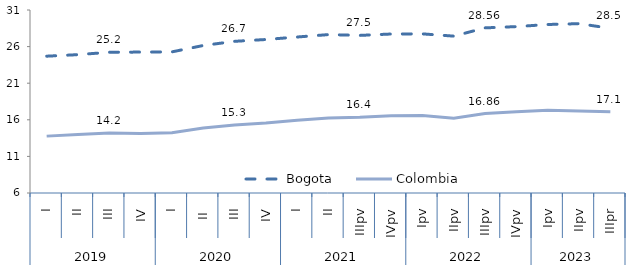
| Category | Bogota | Colombia |
|---|---|---|
| 0 | 24.69 | 13.77 |
| 1 | 24.9 | 13.99 |
| 2 | 25.23 | 14.2 |
| 3 | 25.25 | 14.14 |
| 4 | 25.28 | 14.23 |
| 5 | 26.15 | 14.88 |
| 6 | 26.72 | 15.29 |
| 7 | 26.97 | 15.56 |
| 8 | 27.31 | 15.93 |
| 9 | 27.64 | 16.26 |
| 10 | 27.53 | 16.36 |
| 11 | 27.72 | 16.56 |
| 12 | 27.74 | 16.58 |
| 13 | 27.43 | 16.22 |
| 14 | 28.56 | 16.86 |
| 15 | 28.73 | 17.09 |
| 16 | 29.02 | 17.3 |
| 17 | 29.133 | 17.2 |
| 18 | 28.5 | 17.1 |